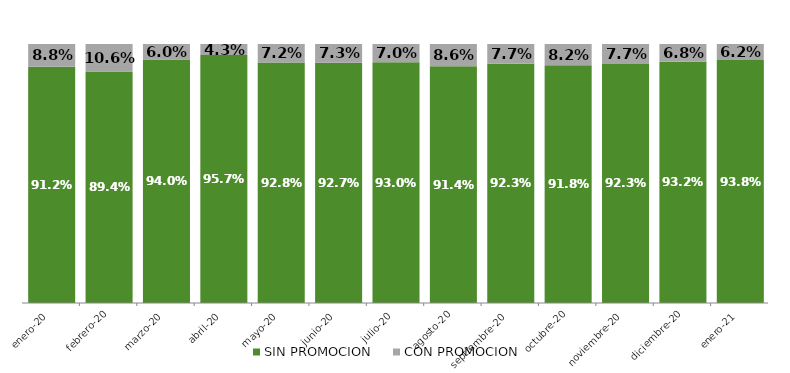
| Category | SIN PROMOCION   | CON PROMOCION   |
|---|---|---|
| 2020-01-01 | 0.912 | 0.088 |
| 2020-02-01 | 0.894 | 0.106 |
| 2020-03-01 | 0.94 | 0.06 |
| 2020-04-01 | 0.957 | 0.043 |
| 2020-05-01 | 0.928 | 0.072 |
| 2020-06-01 | 0.927 | 0.073 |
| 2020-07-01 | 0.93 | 0.07 |
| 2020-08-01 | 0.914 | 0.086 |
| 2020-09-01 | 0.923 | 0.077 |
| 2020-10-01 | 0.918 | 0.082 |
| 2020-11-01 | 0.923 | 0.077 |
| 2020-12-01 | 0.932 | 0.068 |
| 2021-01-01 | 0.938 | 0.062 |